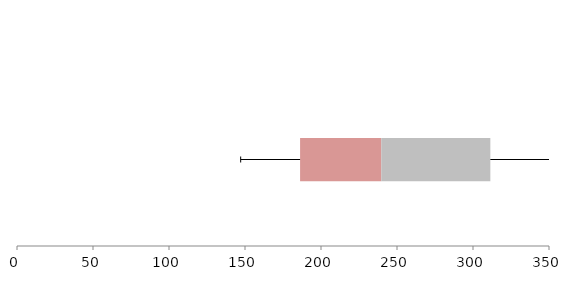
| Category | Series 1 | Series 2 | Series 3 |
|---|---|---|---|
| 0 | 186.239 | 53.426 | 71.74 |